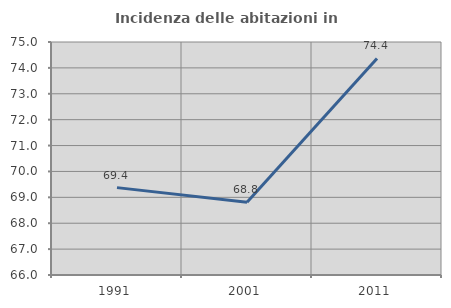
| Category | Incidenza delle abitazioni in proprietà  |
|---|---|
| 1991.0 | 69.375 |
| 2001.0 | 68.807 |
| 2011.0 | 74.363 |